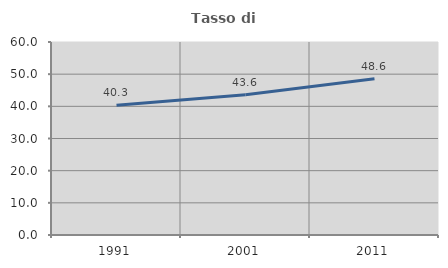
| Category | Tasso di occupazione   |
|---|---|
| 1991.0 | 40.31 |
| 2001.0 | 43.627 |
| 2011.0 | 48.55 |